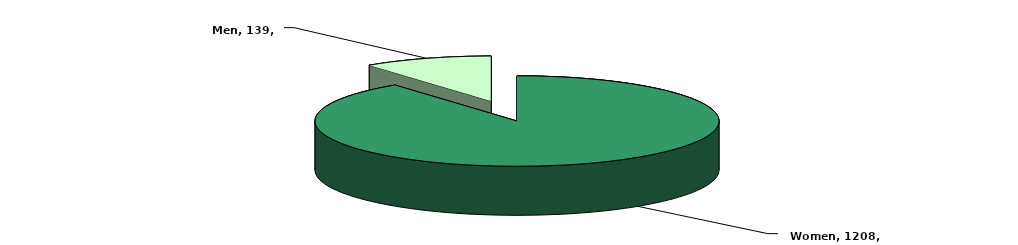
| Category | Number |
|---|---|
| Women | 1208 |
| Men | 139 |